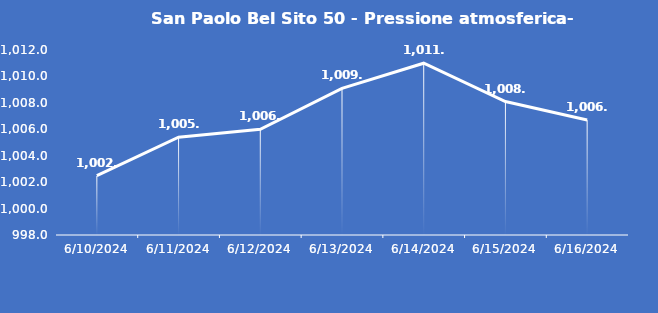
| Category | San Paolo Bel Sito 50 - Pressione atmosferica- Grezzo (hPa) |
|---|---|
| 6/10/24 | 1002.5 |
| 6/11/24 | 1005.4 |
| 6/12/24 | 1006 |
| 6/13/24 | 1009.1 |
| 6/14/24 | 1011 |
| 6/15/24 | 1008.1 |
| 6/16/24 | 1006.7 |